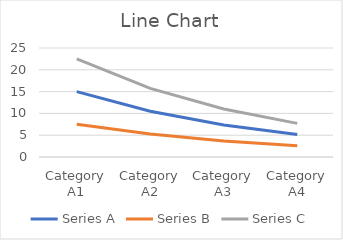
| Category | Series A | Series B | Series C |
|---|---|---|---|
| Category A1 | 15 | 7.5 | 22.5 |
| Category A2 | 10.5 | 5.25 | 15.75 |
| Category A3 | 7.35 | 3.675 | 11.025 |
| Category A4 | 5.145 | 2.572 | 7.717 |